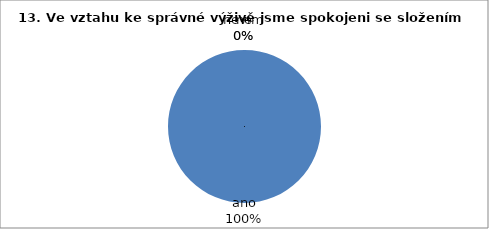
| Category | 13. Ve vztahu ke správné výživě jsme spokojeni se složením jídelníčku. |
|---|---|
| ano | 37 |
| ne | 0 |
| nevím | 0 |